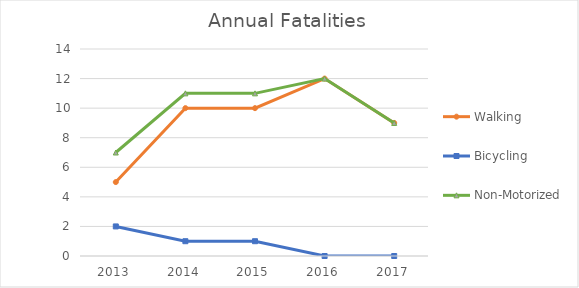
| Category | Walking | Bicycling | Non-Motorized |
|---|---|---|---|
| 2013 | 5 | 2 | 7 |
| 2014 | 10 | 1 | 11 |
| 2015 | 10 | 1 | 11 |
| 2016 | 12 | 0 | 12 |
| 2017 | 9 | 0 | 9 |